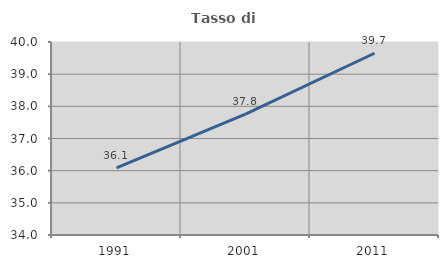
| Category | Tasso di occupazione   |
|---|---|
| 1991.0 | 36.09 |
| 2001.0 | 37.757 |
| 2011.0 | 39.65 |